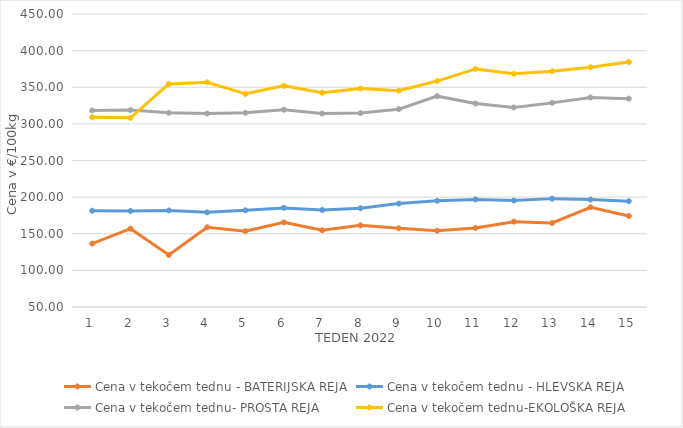
| Category | Cena v tekočem tednu - BATERIJSKA REJA | Cena v tekočem tednu - HLEVSKA REJA | Cena v tekočem tednu- PROSTA REJA | Cena v tekočem tednu-EKOLOŠKA REJA |
|---|---|---|---|---|
| 1.0 | 136.59 | 181.38 | 318.4 | 308.97 |
| 2.0 | 156.88 | 181.07 | 318.82 | 308.28 |
| 3.0 | 121.07 | 181.83 | 315.14 | 354.48 |
| 4.0 | 158.82 | 179.22 | 314.08 | 356.72 |
| 5.0 | 153.55 | 181.96 | 315.1 | 341.03 |
| 6.0 | 165.51 | 185.31 | 319.38 | 351.9 |
| 7.0 | 154.74 | 182.45 | 314.16 | 342.59 |
| 8.0 | 161.48 | 184.77 | 314.71 | 348.28 |
| 9.0 | 157.38 | 191.21 | 320.1 | 345.35 |
| 10.0 | 154.16 | 195.04 | 337.83 | 358.45 |
| 11.0 | 157.96 | 196.88 | 327.79 | 375 |
| 12.0 | 166.49 | 195.36 | 322.46 | 368.45 |
| 13.0 | 164.66 | 197.95 | 328.67 | 371.9 |
| 14.0 | 186.11 | 196.59 | 336.02 | 377.24 |
| 15.0 | 174.18 | 194.49 | 334.46 | 384.48 |